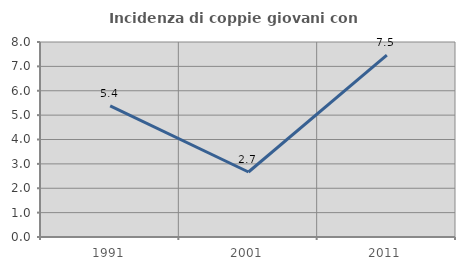
| Category | Incidenza di coppie giovani con figli |
|---|---|
| 1991.0 | 5.376 |
| 2001.0 | 2.667 |
| 2011.0 | 7.463 |